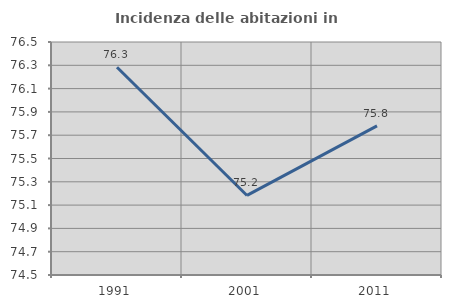
| Category | Incidenza delle abitazioni in proprietà  |
|---|---|
| 1991.0 | 76.284 |
| 2001.0 | 75.183 |
| 2011.0 | 75.78 |